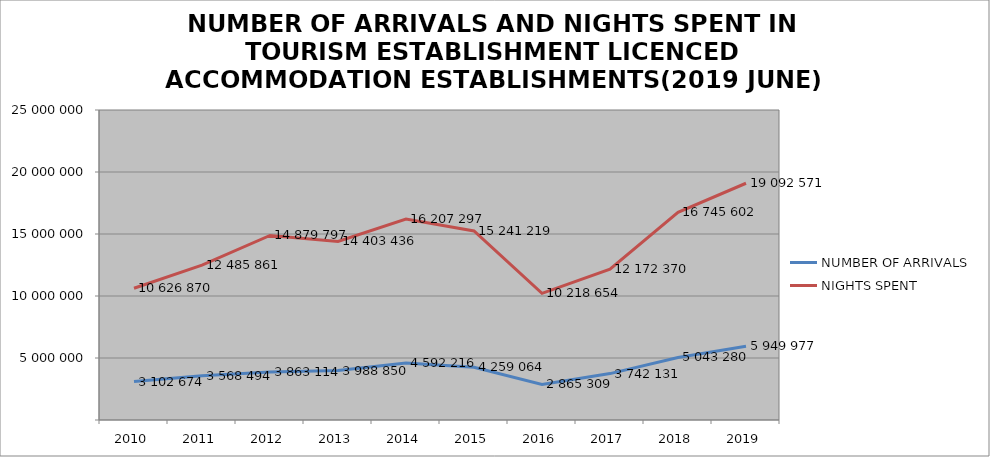
| Category | NUMBER OF ARRIVALS | NIGHTS SPENT |
|---|---|---|
| 2010 | 3102674 | 10626870 |
| 2011 | 3568494 | 12485861 |
| 2012 | 3863114 | 14879797 |
| 2013 | 3988850 | 14403436 |
| 2014 | 4592216 | 16207297 |
| 2015 | 4259064 | 15241219 |
| 2016 | 2865309 | 10218654 |
| 2017 | 3742131 | 12172370 |
| 2018 | 5043280 | 16745602 |
| 2019 | 5949977 | 19092571 |